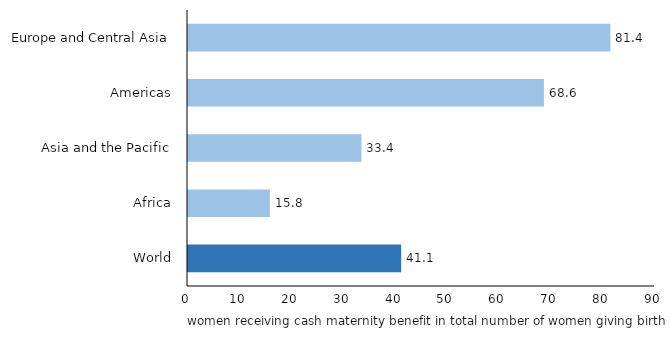
| Category | Series 0 |
|---|---|
| World | 41.081 |
| Africa | 15.78 |
| Asia and the Pacific | 33.431 |
| Americas | 68.598 |
| Europe and Central Asia | 81.409 |